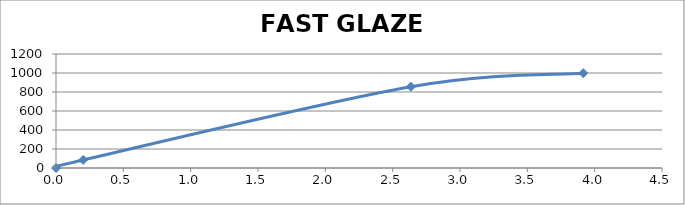
| Category | FAST GLAZE CHART |
|---|---|
| 0.0 | 0 |
| 0.202105263157895 | 85 |
| 2.635439298245613 | 855.556 |
| 3.915437298245613 | 997.778 |